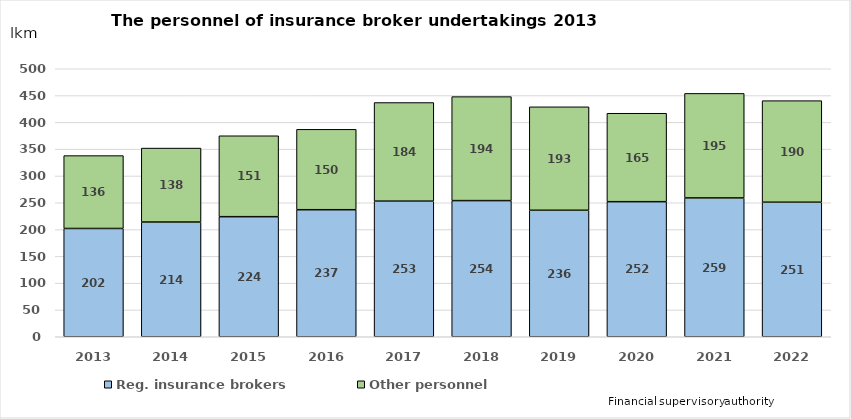
| Category | Reg. insurance brokers | Other personnel |
|---|---|---|
| 2013.0 | 202 | 136 |
| 2014.0 | 214 | 138 |
| 2015.0 | 224 | 151 |
| 2016.0 | 237 | 150 |
| 2017.0 | 253 | 184 |
| 2018.0 | 254 | 194 |
| 2019.0 | 236 | 193 |
| 2020.0 | 252 | 165 |
| 2021.0 | 259 | 195 |
| 2022.0 | 251 | 189.5 |